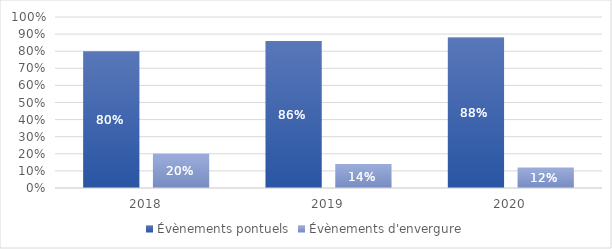
| Category | Évènements pontuels | Évènements d'envergure |
|---|---|---|
| 2018.0 | 0.8 | 0.2 |
| 2019.0 | 0.86 | 0.14 |
| 2020.0 | 0.88 | 0.12 |